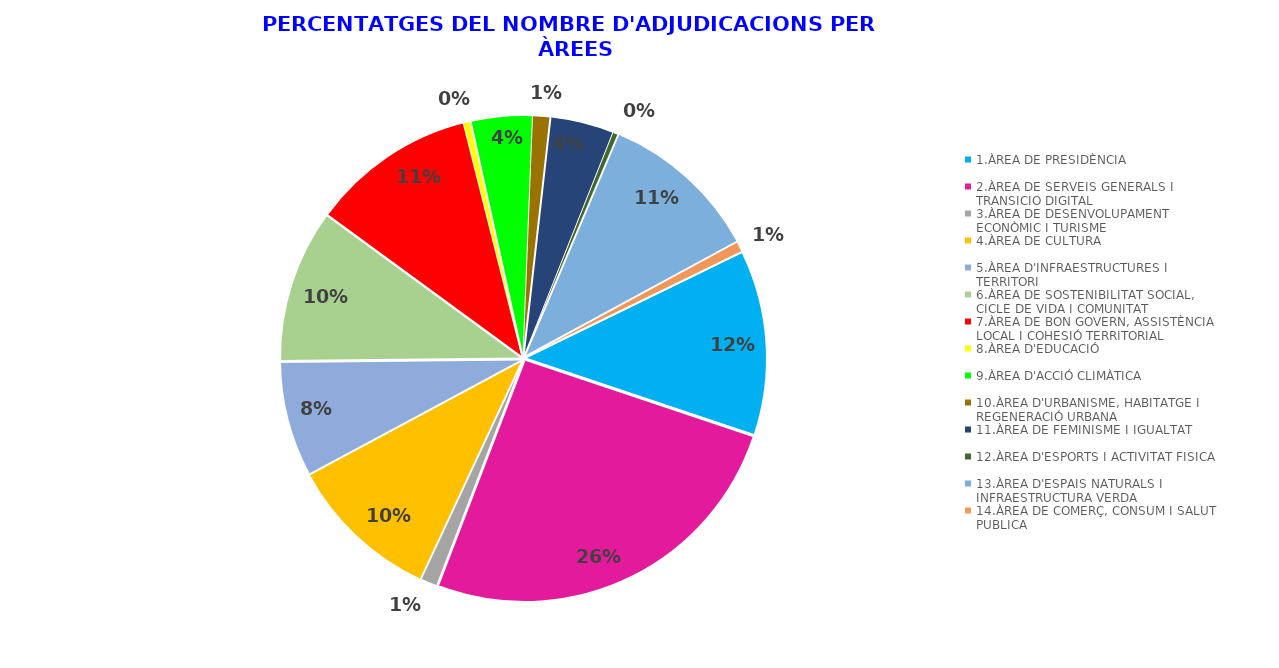
| Category | Series 0 |
|---|---|
| 1.ÀREA DE PRESIDÈNCIA | 0.124 |
| 2.ÀREA DE SERVEIS GENERALS I TRANSICIO DIGITAL | 0.257 |
| 3.ÀREA DE DESENVOLUPAMENT ECONÒMIC I TURISME  | 0.011 |
| 4.ÀREA DE CULTURA | 0.102 |
| 5.ÀREA D'INFRAESTRUCTURES I TERRITORI | 0.077 |
| 6.ÀREA DE SOSTENIBILITAT SOCIAL, CICLE DE VIDA I COMUNITAT | 0.102 |
| 7.ÀREA DE BON GOVERN, ASSISTÈNCIA LOCAL I COHESIÓ TERRITORIAL | 0.11 |
| 8.ÀREA D'EDUCACIÓ | 0.005 |
| 9.ÀREA D'ACCIÓ CLIMÀTICA | 0.041 |
| 10.ÀREA D'URBANISME, HABITATGE I REGENERACIÓ URBANA | 0.012 |
| 11.ÀREA DE FEMINISME I IGUALTAT | 0.042 |
| 12.ÀREA D'ESPORTS I ACTIVITAT FISICA | 0.004 |
| 13.ÀREA D'ESPAIS NATURALS I INFRAESTRUCTURA VERDA | 0.107 |
| 14.ÀREA DE COMERÇ, CONSUM I SALUT PUBLICA | 0.007 |